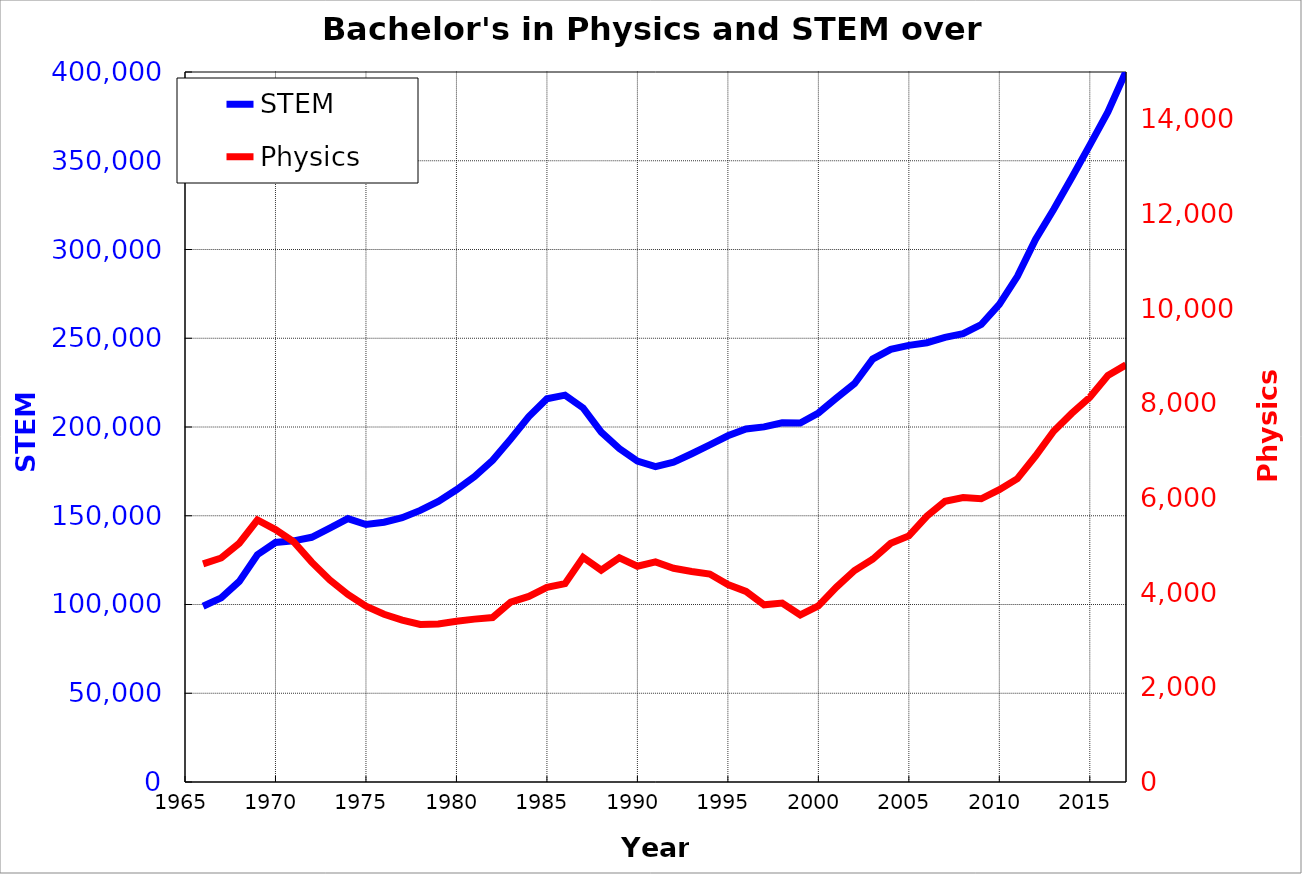
| Category | STEM |
|---|---|
| 1966.0 | 99013 |
| 1967.0 | 103727 |
| 1968.0 | 113023 |
| 1969.0 | 128064 |
| 1970.0 | 134934 |
| 1971.0 | 135877 |
| 1972.0 | 137853 |
| 1973.0 | 143065 |
| 1974.0 | 148369 |
| 1975.0 | 145055 |
| 1976.0 | 146342 |
| 1977.0 | 148909 |
| 1978.0 | 153011 |
| 1979.0 | 158124 |
| 1980.0 | 164619 |
| 1981.0 | 172042 |
| 1982.0 | 181272 |
| 1983.0 | 193271 |
| 1984.0 | 205838 |
| 1985.0 | 215945 |
| 1986.0 | 217936 |
| 1987.0 | 210750 |
| 1988.0 | 197090 |
| 1989.0 | 187843 |
| 1990.0 | 180752 |
| 1991.0 | 177683 |
| 1992.0 | 180201 |
| 1993.0 | 184950 |
| 1994.0 | 189875 |
| 1995.0 | 195031 |
| 1996.0 | 198893 |
| 1997.0 | 200078 |
| 1998.0 | 202414 |
| 1999.0 | 202228 |
| 2000.0 | 207875 |
| 2001.0 | 216326 |
| 2002.0 | 224526 |
| 2003.0 | 238269 |
| 2004.0 | 243764 |
| 2005.0 | 245984 |
| 2006.0 | 247482 |
| 2007.0 | 250474 |
| 2008.0 | 252570 |
| 2009.0 | 257720 |
| 2010.0 | 269095 |
| 2011.0 | 284868 |
| 2012.0 | 305637 |
| 2013.0 | 322517 |
| 2014.0 | 340390 |
| 2015.0 | 358802 |
| 2016.0 | 377448 |
| 2017.0 | 400339 |